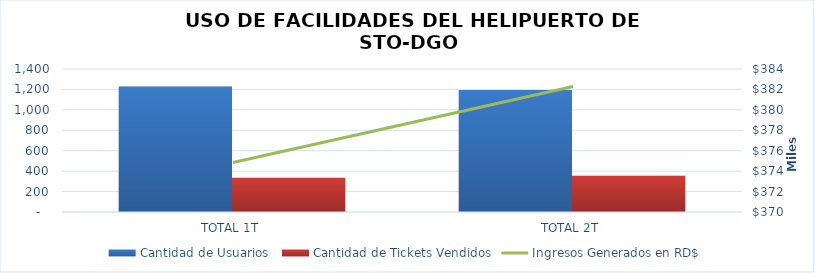
| Category | Cantidad de Usuarios  | Cantidad de Tickets Vendidos |
|---|---|---|
| TOTAL 1T | 1228 | 335 |
| TOTAL 2T | 1194 | 355 |